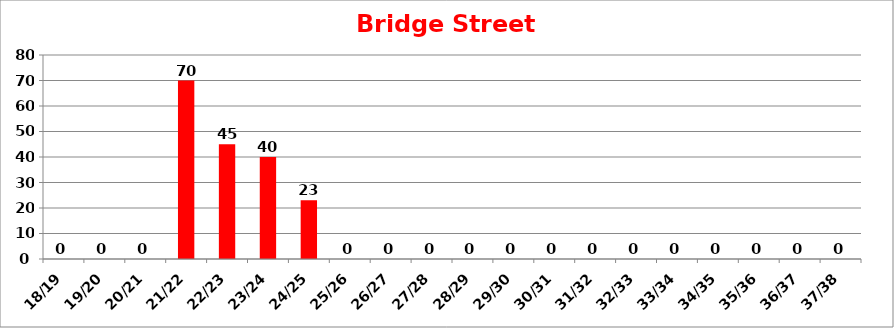
| Category | Bridge Street Quarter |
|---|---|
| 18/19 | 0 |
| 19/20 | 0 |
| 20/21 | 0 |
| 21/22 | 70 |
| 22/23 | 45 |
| 23/24 | 40 |
| 24/25 | 23 |
| 25/26 | 0 |
| 26/27 | 0 |
| 27/28 | 0 |
| 28/29 | 0 |
| 29/30 | 0 |
| 30/31 | 0 |
| 31/32 | 0 |
| 32/33 | 0 |
| 33/34 | 0 |
| 34/35 | 0 |
| 35/36 | 0 |
| 36/37 | 0 |
| 37/38 | 0 |